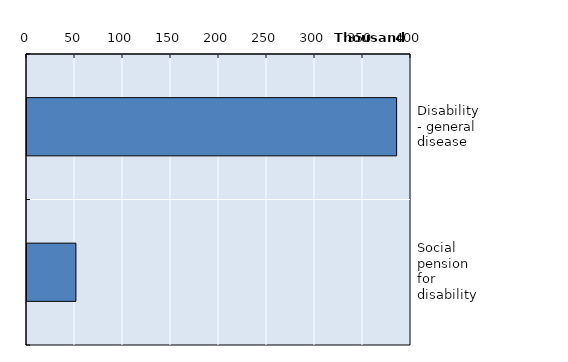
| Category | Series 0 |
|---|---|
| Disability - general disease | 385017 |
| Social pension for disability | 50948 |